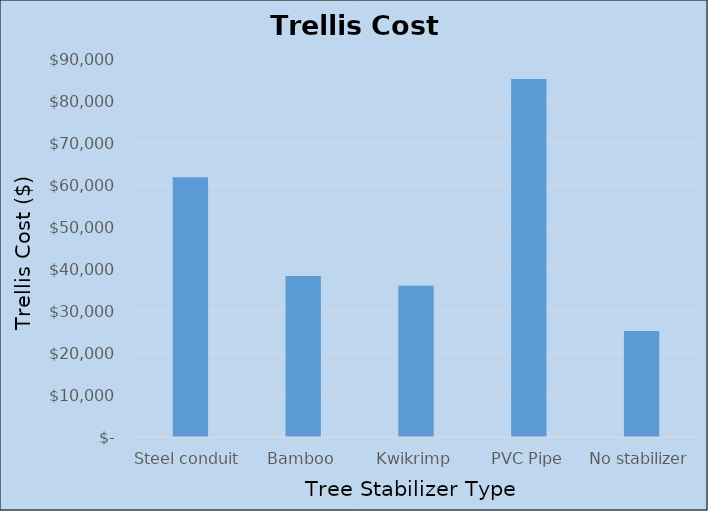
| Category | Series 0 |
|---|---|
| Steel conduit | 61838.913 |
| Bamboo | 38318.913 |
| Kwikrimp | 36038.913 |
| PVC Pipe | 85238.912 |
| No stabilizer | 25238.913 |